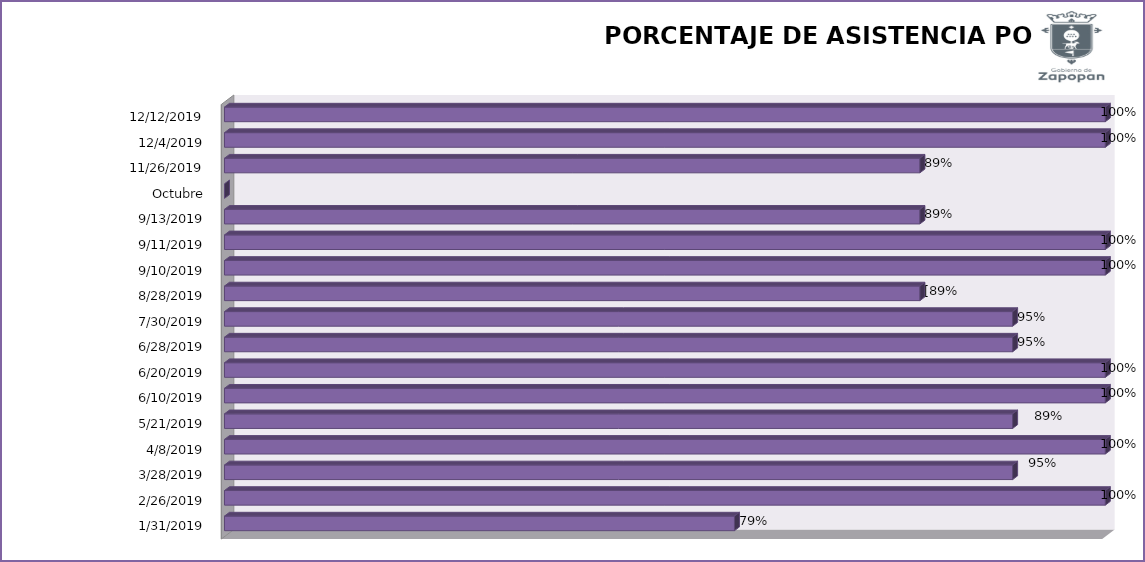
| Category | Series 0 |
|---|---|
| 31/01/2019 | 78.947 |
| 26/02/2019 | 100 |
| 28/03/2019 | 94.737 |
| 08/04/2019 | 100 |
| 21/05/2019 | 94.737 |
| 10/06/2019 | 100 |
| 20/06/2019 | 100 |
| 28/06/2019 | 94.737 |
| 30/07/2019 | 94.737 |
| 28/08/2019 | 89.474 |
| 10/09/2019 | 100 |
| 11/09/2019 | 100 |
| 13/09/2019 | 89.474 |
| Octubre | 0 |
| 26/11/2019 | 89.474 |
| 04/12/2019 | 100 |
| 12/12/2019 | 100 |